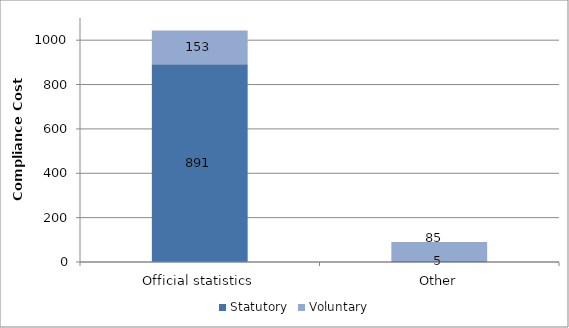
| Category | Statutory | Voluntary |
|---|---|---|
| Official statistics | 891 | 153 |
| Other | 5 | 85 |